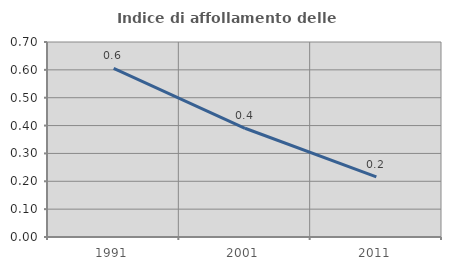
| Category | Indice di affollamento delle abitazioni  |
|---|---|
| 1991.0 | 0.605 |
| 2001.0 | 0.39 |
| 2011.0 | 0.216 |